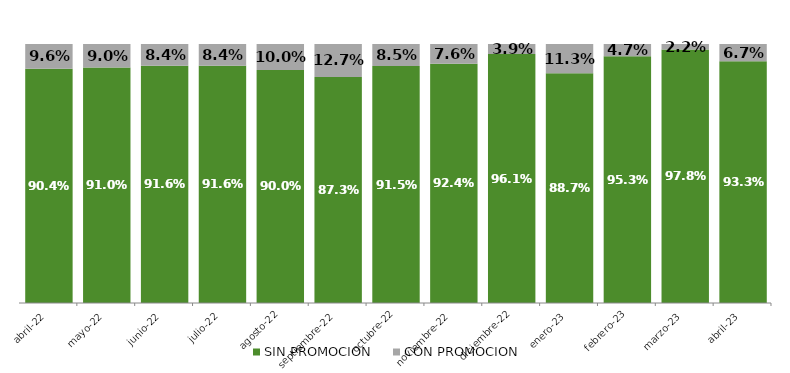
| Category | SIN PROMOCION   | CON PROMOCION   |
|---|---|---|
| 2022-04-01 | 0.904 | 0.096 |
| 2022-05-01 | 0.91 | 0.09 |
| 2022-06-01 | 0.916 | 0.084 |
| 2022-07-01 | 0.916 | 0.084 |
| 2022-08-01 | 0.9 | 0.1 |
| 2022-09-01 | 0.873 | 0.127 |
| 2022-10-01 | 0.915 | 0.085 |
| 2022-11-01 | 0.924 | 0.076 |
| 2022-12-01 | 0.961 | 0.039 |
| 2023-01-01 | 0.887 | 0.113 |
| 2023-02-01 | 0.953 | 0.047 |
| 2023-03-01 | 0.978 | 0.022 |
| 2023-04-01 | 0.933 | 0.067 |